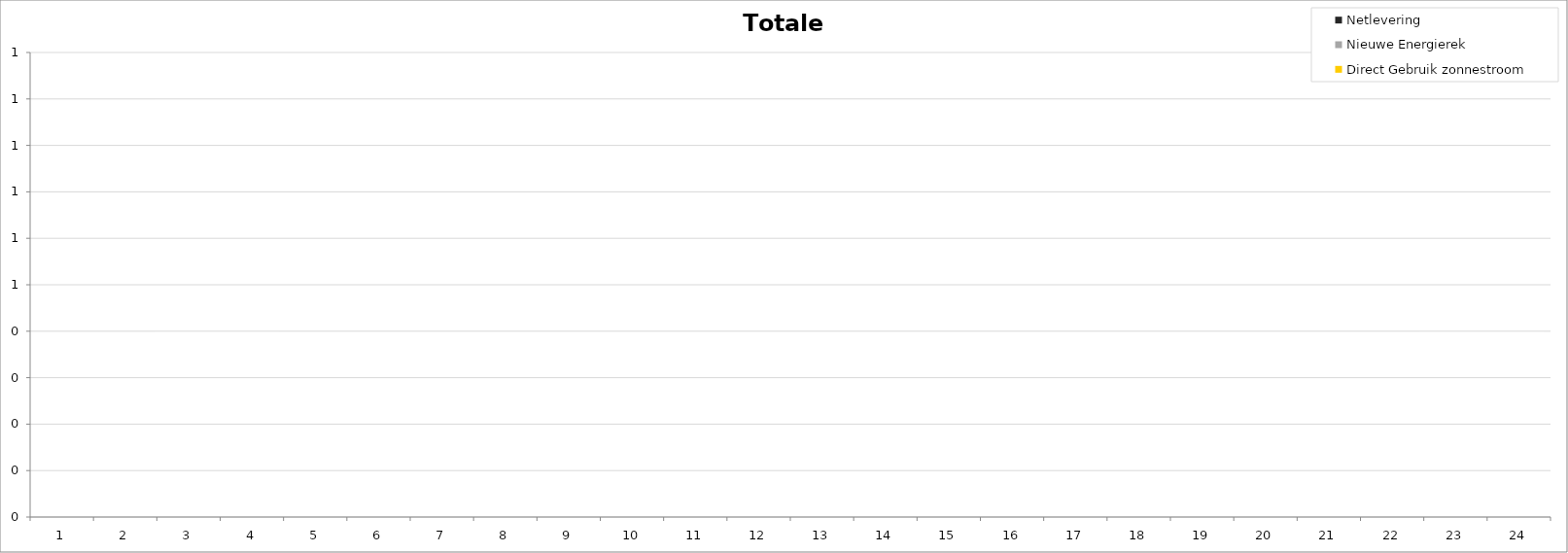
| Category | Direct Gebruik zonnestroom | Nieuwe Energierek | Netlevering |
|---|---|---|---|
| 0 | 0 | 0 | 0 |
| 1900-01-01 | 0 | 0 | 0 |
| 1900-01-02 | 0 | 0 | 0 |
| 1900-01-03 | 0 | 0 | 0 |
| 1900-01-04 | 0 | 0 | 0 |
| 1900-01-05 | 0 | 0 | 0 |
| 1900-01-06 | 0 | 0 | 0 |
| 1900-01-07 | 0 | 0 | 0 |
| 1900-01-08 | 0 | 0 | 0 |
| 1900-01-09 | 0 | 0 | 0 |
| 1900-01-10 | 0 | 0 | 0 |
| 1900-01-11 | 0 | 0 | 0 |
| 1900-01-12 | 0 | 0 | 0 |
| 1900-01-13 | 0 | 0 | 0 |
| 1900-01-14 | 0 | 0 | 0 |
| 1900-01-15 | 0 | 0 | 0 |
| 1900-01-16 | 0 | 0 | 0 |
| 1900-01-17 | 0 | 0 | 0 |
| 1900-01-18 | 0 | 0 | 0 |
| 1900-01-19 | 0 | 0 | 0 |
| 1900-01-20 | 0 | 0 | 0 |
| 1900-01-21 | 0 | 0 | 0 |
| 1900-01-22 | 0 | 0 | 0 |
| 1900-01-23 | 0 | 0 | 0 |